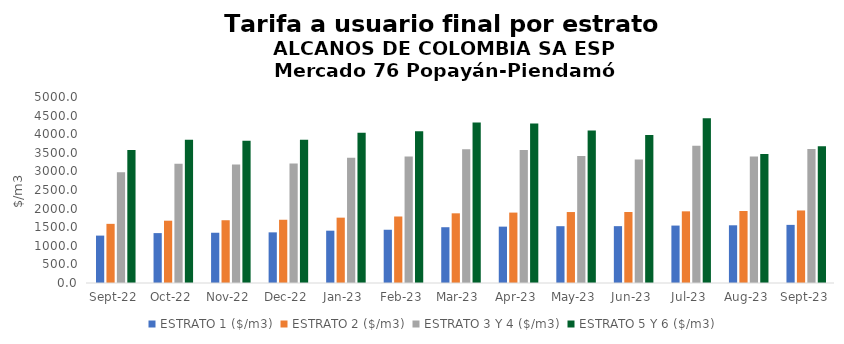
| Category | ESTRATO 1 ($/m3) | ESTRATO 2 ($/m3) | ESTRATO 3 Y 4 ($/m3) | ESTRATO 5 Y 6 ($/m3) |
|---|---|---|---|---|
| 2022-09-01 | 1273.99 | 1590.22 | 2979.32 | 3575.184 |
| 2022-10-01 | 1341.42 | 1674.98 | 3208.12 | 3849.744 |
| 2022-11-01 | 1350.95 | 1687.14 | 3185.9 | 3823.08 |
| 2022-12-01 | 1361.48 | 1700.11 | 3209.93 | 3851.916 |
| 2023-01-01 | 1406.32 | 1756.53 | 3365.49 | 4038.588 |
| 2023-02-01 | 1431.45 | 1787.62 | 3398.26 | 4077.912 |
| 2023-03-01 | 1499.4 | 1873.1 | 3596.1 | 4315.32 |
| 2023-04-01 | 1515.22 | 1892.7 | 3575.22 | 4290.264 |
| 2023-05-01 | 1527.06 | 1907.55 | 3416.65 | 4099.98 |
| 2023-06-01 | 1528.08 | 1909 | 3316.57 | 3979.884 |
| 2023-07-01 | 1543.84 | 1926.61 | 3689.81 | 4427.772 |
| 2023-08-01 | 1551.43 | 1936.32 | 3401.48 | 3469.51 |
| 2023-09-01 | 1562.51 | 1949.77 | 3603.59 | 3675.662 |